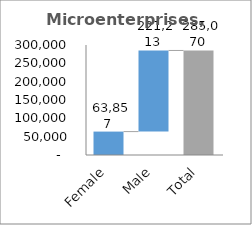
| Category | SME | Micro |
|---|---|---|
| Fully Constrained | 0.316 | 0.203 |
| Partly Constrained | 0.118 | 0.21 |
| Unconstrained | 0.566 | 0.587 |